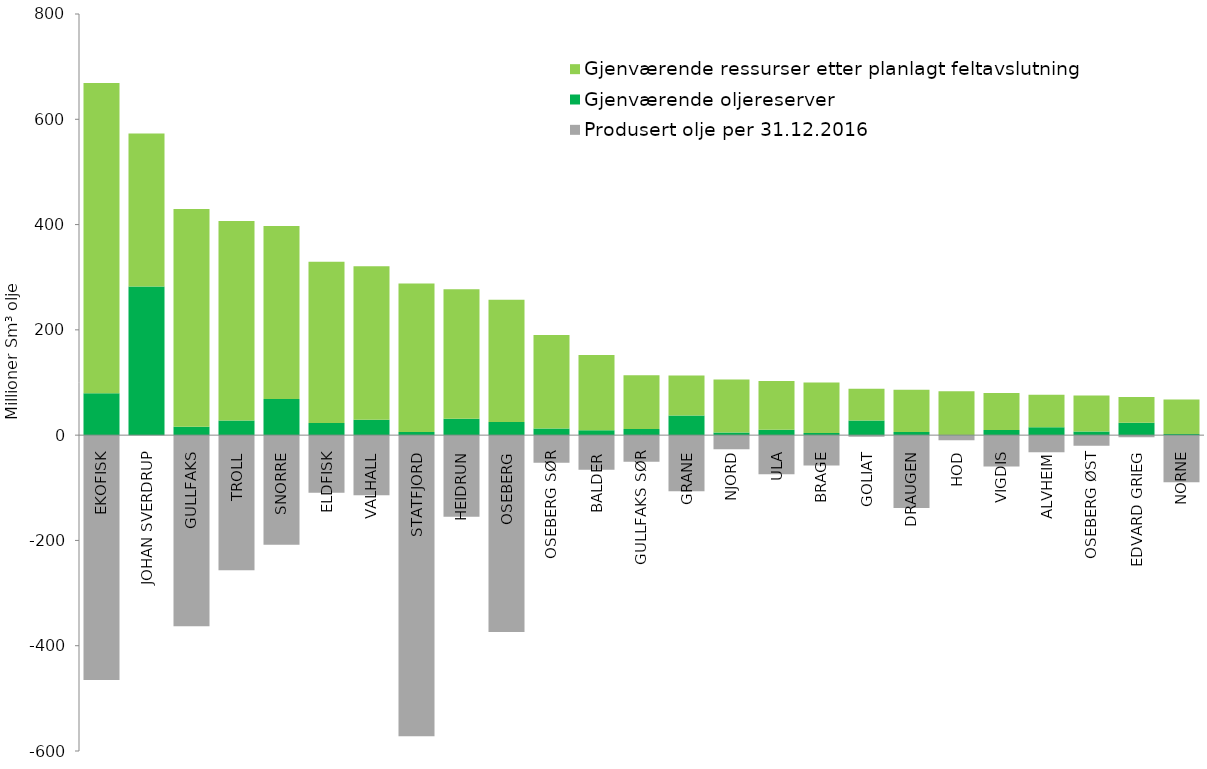
| Category | Produsert olje per 31.12.2016 | Gjenværende oljereserver | Gjenværende ressurser etter planlagt feltavslutning |
|---|---|---|---|
| EKOFISK | -465.2 | 79.51 | 589.49 |
| JOHAN SVERDRUP | 0 | 282.29 | 290.71 |
| GULLFAKS | -362.98 | 16.08 | 413.55 |
| TROLL | -256.51 | 27.95 | 379.04 |
| SNORRE | -208.09 | 68.76 | 328.6 |
| ELDFISK | -109.24 | 23.26 | 306.31 |
| VALHALL | -114.3 | 29.34 | 291.57 |
| STATFJORD | -571.96 | 5.85 | 282.01 |
| HEIDRUN | -154.89 | 31.15 | 245.96 |
| OSEBERG | -374.14 | 24.94 | 232.06 |
| OSEBERG SØR | -52.3 | 12.58 | 177.62 |
| BALDER | -65.52 | 9.48 | 142.93 |
| GULLFAKS SØR | -50.31 | 11.74 | 101.82 |
| GRANE | -106.72 | 37.47 | 75.81 |
| NJORD | -26.63 | 5.15 | 100.41 |
| ULA | -74.37 | 10.08 | 92.68 |
| BRAGE | -57.74 | 4.25 | 95.81 |
| GOLIAT | -2.97 | 28.03 | 60.3 |
| DRAUGEN | -138.21 | 6.04 | 80.15 |
| HOD | -9.74 | 0.39 | 83.09 |
| VIGDIS | -59.5 | 9.62 | 70.29 |
| ALVHEIM | -32.27 | 14.85 | 61.81 |
| OSEBERG ØST | -20.35 | 6.72 | 68.52 |
| EDVARD GRIEG | -4.05 | 23.63 | 48.92 |
| NORNE | -89.53 | 1.96 | 65.51 |